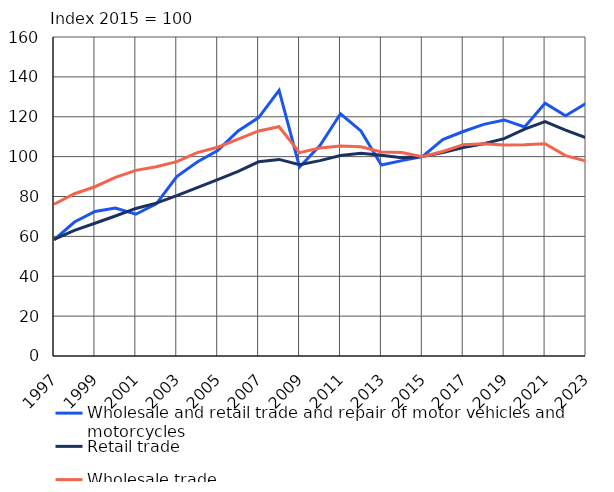
| Category | Wholesale and retail trade and repair of motor vehicles and motorcycles | Retail trade | Wholesale trade |
|---|---|---|---|
| 1997.0 | 58.2 | 58.5 | 76.1 |
| 1998.0 | 67.2 | 63 | 81.4 |
| 1999.0 | 72.5 | 66.6 | 84.9 |
| 2000.0 | 74.2 | 70.2 | 89.6 |
| 2001.0 | 71.1 | 74 | 93.1 |
| 2002.0 | 76.3 | 76.7 | 94.9 |
| 2003.0 | 90 | 80.4 | 97.5 |
| 2004.0 | 97.3 | 84.5 | 102 |
| 2005.0 | 103.1 | 88.5 | 104.7 |
| 2006.0 | 112.9 | 92.6 | 108.8 |
| 2007.0 | 119.6 | 97.4 | 112.9 |
| 2008.0 | 133.2 | 98.6 | 115 |
| 2009.0 | 94.8 | 95.9 | 102 |
| 2010.0 | 105.5 | 98 | 104.3 |
| 2011.0 | 121.5 | 100.6 | 105.3 |
| 2012.0 | 112.9 | 101.7 | 104.9 |
| 2013.0 | 95.8 | 100.7 | 102.3 |
| 2014.0 | 98 | 99.5 | 102.1 |
| 2015.0 | 100 | 100 | 100 |
| 2016.0 | 108.5 | 102 | 102.6 |
| 2017.0 | 112.6 | 104.6 | 106 |
| 2018.0 | 116.2 | 106.5 | 106.4 |
| 2019.0 | 118.4 | 109 | 105.8 |
| 2020.0 | 114.9 | 113.8 | 105.9 |
| 2021.0 | 126.8 | 117.6 | 106.5 |
| 2022.0 | 120.5 | 113.3 | 100.5 |
| 2023.0 | 126.7 | 109.5 | 97.8 |